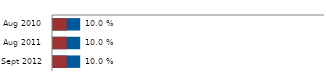
| Category | Global acute malnutrition | Severe acute malnutrition |
|---|---|---|
| 2010-08-01 | 0.1 | 0.05 |
| 2011-08-01 | 0.1 | 0.05 |
| 2012-09-01 | 0.1 | 0.05 |